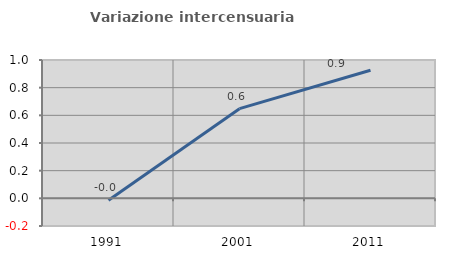
| Category | Variazione intercensuaria annua |
|---|---|
| 1991.0 | -0.014 |
| 2001.0 | 0.648 |
| 2011.0 | 0.926 |